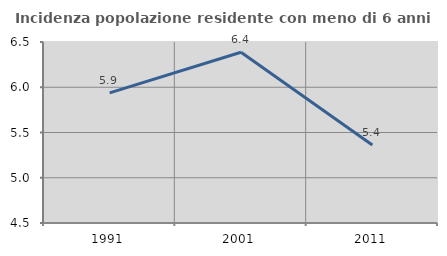
| Category | Incidenza popolazione residente con meno di 6 anni |
|---|---|
| 1991.0 | 5.938 |
| 2001.0 | 6.386 |
| 2011.0 | 5.362 |